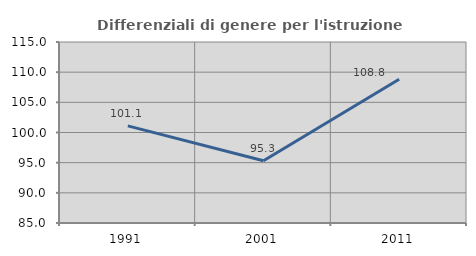
| Category | Differenziali di genere per l'istruzione superiore |
|---|---|
| 1991.0 | 101.099 |
| 2001.0 | 95.32 |
| 2011.0 | 108.824 |